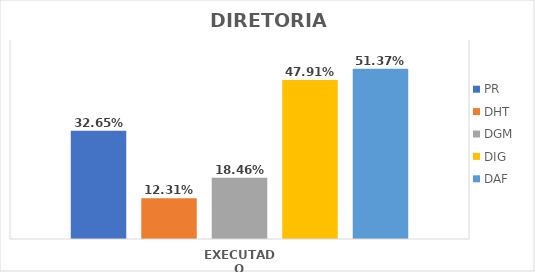
| Category | PR | DHT | DGM | DIG | DAF |
|---|---|---|---|---|---|
| EXECUTADO | 0.327 | 0.123 | 0.185 | 0.479 | 0.514 |